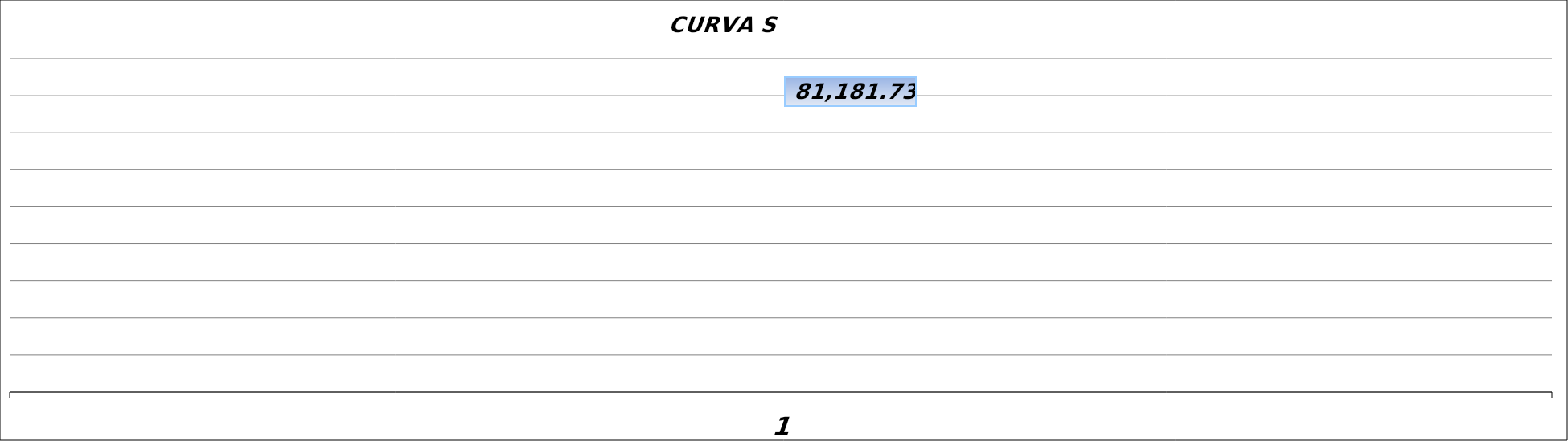
| Category | Series 0 |
|---|---|
| 0 | 81181.729 |